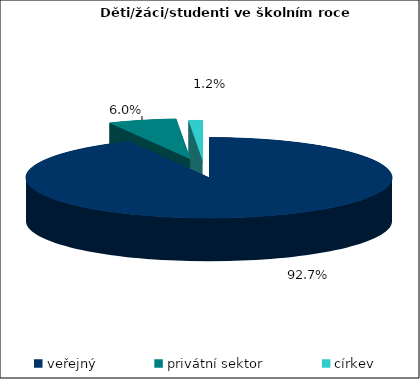
| Category | 2021/22 |
|---|---|
| veřejný | 1664954 |
| privátní sektor | 108313 |
| církev | 22024 |